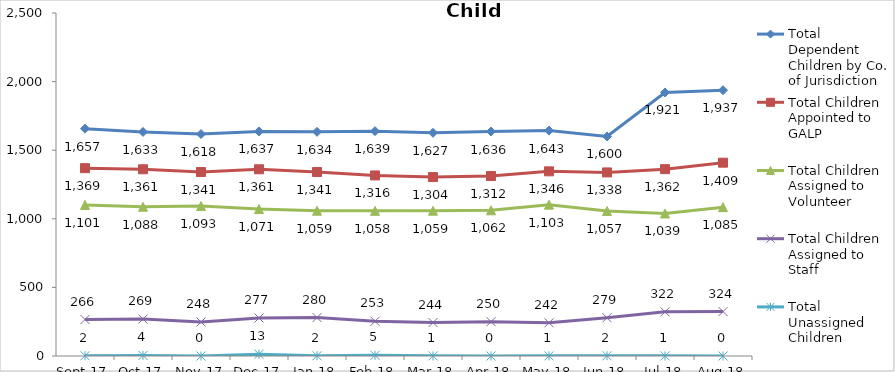
| Category | Total Dependent Children by Co. of Jurisdiction | Total Children Appointed to GALP | Total Children Assigned to Volunteer | Total Children Assigned to Staff | Total Unassigned Children |
|---|---|---|---|---|---|
| 2017-09-01 | 1657 | 1369 | 1101 | 266 | 2 |
| 2017-10-01 | 1633 | 1361 | 1088 | 269 | 4 |
| 2017-11-01 | 1618 | 1341 | 1093 | 248 | 0 |
| 2017-12-01 | 1637 | 1361 | 1071 | 277 | 13 |
| 2018-01-01 | 1634 | 1341 | 1059 | 280 | 2 |
| 2018-02-01 | 1639 | 1316 | 1058 | 253 | 5 |
| 2018-03-01 | 1627 | 1304 | 1059 | 244 | 1 |
| 2018-04-01 | 1636 | 1312 | 1062 | 250 | 0 |
| 2018-05-01 | 1643 | 1346 | 1103 | 242 | 1 |
| 2018-06-01 | 1600 | 1338 | 1057 | 279 | 2 |
| 2018-07-01 | 1921 | 1362 | 1039 | 322 | 1 |
| 2018-08-01 | 1937 | 1409 | 1085 | 324 | 0 |